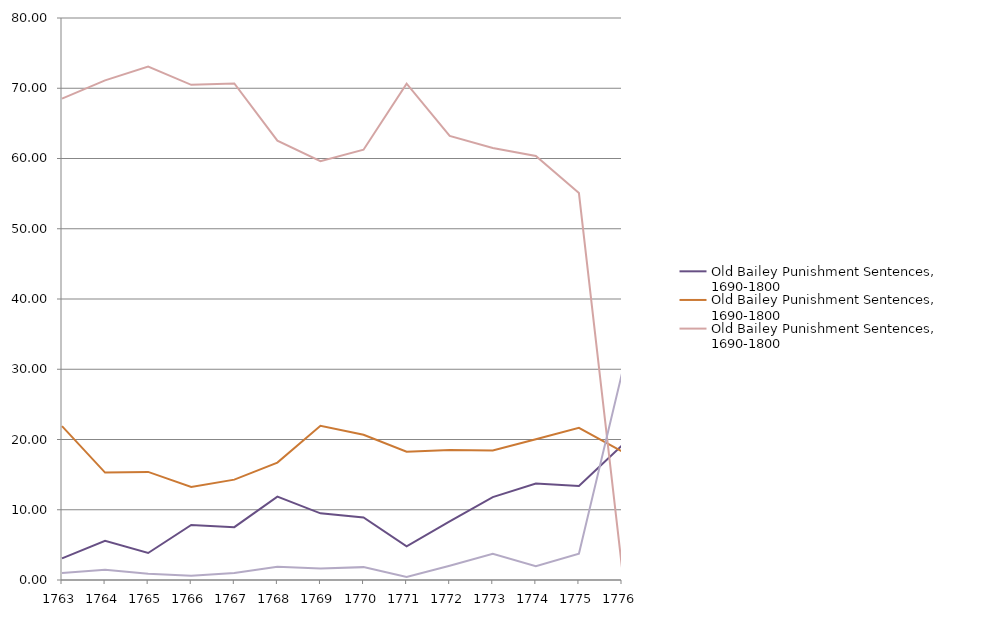
| Category | Old Bailey Punishment Sentences, 1690-1800 |
|---|---|
| 1763 | 1 |
| 1764 | 1.456 |
| 1765 | 0.888 |
| 1766 | 0.602 |
| 1767 | 1.003 |
| 1768 | 1.887 |
| 1769 | 1.626 |
| 1770 | 1.832 |
| 1771 | 0.435 |
| 1772 | 2.032 |
| 1773 | 3.727 |
| 1774 | 1.961 |
| 1775 | 3.743 |
| 1776 | 29.412 |